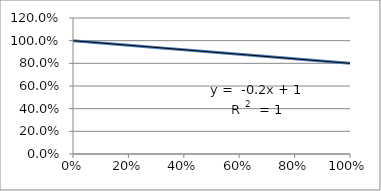
| Category | Series 0 |
|---|---|
| 1.0 | 0.8 |
| 0.8 | 0.84 |
| 0.6 | 0.88 |
| 0.4 | 0.92 |
| 0.2 | 0.96 |
| 0.1 | 0.98 |
| 0.05 | 0.99 |
| 1e-09 | 1 |